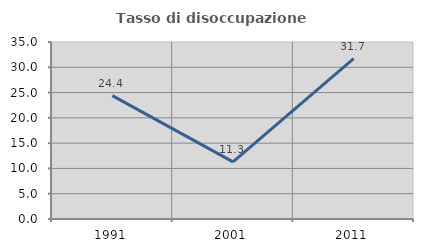
| Category | Tasso di disoccupazione giovanile  |
|---|---|
| 1991.0 | 24.39 |
| 2001.0 | 11.29 |
| 2011.0 | 31.731 |